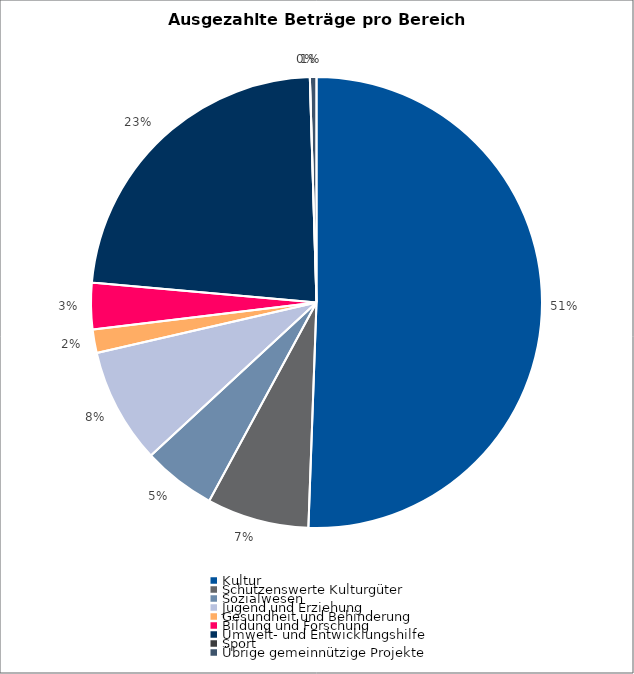
| Category | Series 0 |
|---|---|
| Kultur | 4249752 |
| Schützenswerte Kulturgüter | 614837 |
| Sozialwesen | 440148 |
| Jugend und Erziehung | 695500 |
| Gesundheit und Behinderung | 141000 |
| Bildung und Forschung | 280001 |
| Umwelt- und Entwicklungshilfe | 1942400 |
| Sport | 0 |
| Übrige gemeinnützige Projekte | 39500 |